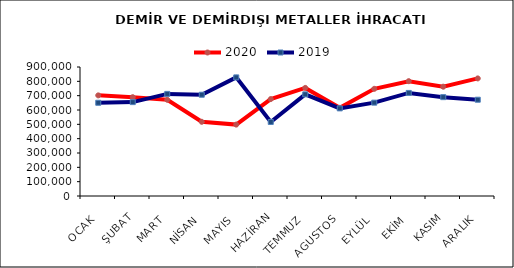
| Category | 2020 | 2019 |
|---|---|---|
| OCAK | 702065.646 | 650412.551 |
| ŞUBAT | 689325.602 | 655044.922 |
| MART | 671306.795 | 712310.894 |
| NİSAN | 517653.102 | 706605.331 |
| MAYIS | 498221.771 | 827448.461 |
| HAZİRAN | 676157.713 | 516668.434 |
| TEMMUZ | 754182.977 | 709133.269 |
| AGUSTOS | 615020.085 | 611246.979 |
| EYLÜL | 747804.743 | 651276.009 |
| EKİM | 801065.784 | 719064.593 |
| KASIM | 762566.95 | 689664.211 |
| ARALIK | 820333.851 | 671675.375 |